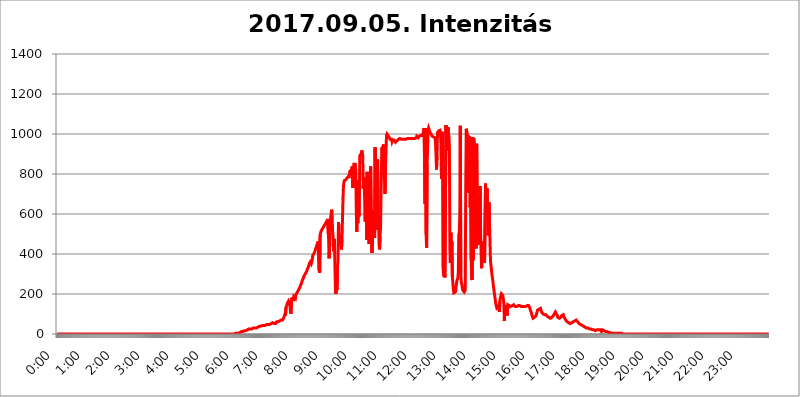
| Category | 2017.09.05. Intenzitás [W/m^2] |
|---|---|
| 0.0 | 0 |
| 0.0006944444444444445 | 0 |
| 0.001388888888888889 | 0 |
| 0.0020833333333333333 | 0 |
| 0.002777777777777778 | 0 |
| 0.003472222222222222 | 0 |
| 0.004166666666666667 | 0 |
| 0.004861111111111111 | 0 |
| 0.005555555555555556 | 0 |
| 0.0062499999999999995 | 0 |
| 0.006944444444444444 | 0 |
| 0.007638888888888889 | 0 |
| 0.008333333333333333 | 0 |
| 0.009027777777777779 | 0 |
| 0.009722222222222222 | 0 |
| 0.010416666666666666 | 0 |
| 0.011111111111111112 | 0 |
| 0.011805555555555555 | 0 |
| 0.012499999999999999 | 0 |
| 0.013194444444444444 | 0 |
| 0.013888888888888888 | 0 |
| 0.014583333333333332 | 0 |
| 0.015277777777777777 | 0 |
| 0.015972222222222224 | 0 |
| 0.016666666666666666 | 0 |
| 0.017361111111111112 | 0 |
| 0.018055555555555557 | 0 |
| 0.01875 | 0 |
| 0.019444444444444445 | 0 |
| 0.02013888888888889 | 0 |
| 0.020833333333333332 | 0 |
| 0.02152777777777778 | 0 |
| 0.022222222222222223 | 0 |
| 0.02291666666666667 | 0 |
| 0.02361111111111111 | 0 |
| 0.024305555555555556 | 0 |
| 0.024999999999999998 | 0 |
| 0.025694444444444447 | 0 |
| 0.02638888888888889 | 0 |
| 0.027083333333333334 | 0 |
| 0.027777777777777776 | 0 |
| 0.02847222222222222 | 0 |
| 0.029166666666666664 | 0 |
| 0.029861111111111113 | 0 |
| 0.030555555555555555 | 0 |
| 0.03125 | 0 |
| 0.03194444444444445 | 0 |
| 0.03263888888888889 | 0 |
| 0.03333333333333333 | 0 |
| 0.034027777777777775 | 0 |
| 0.034722222222222224 | 0 |
| 0.035416666666666666 | 0 |
| 0.036111111111111115 | 0 |
| 0.03680555555555556 | 0 |
| 0.0375 | 0 |
| 0.03819444444444444 | 0 |
| 0.03888888888888889 | 0 |
| 0.03958333333333333 | 0 |
| 0.04027777777777778 | 0 |
| 0.04097222222222222 | 0 |
| 0.041666666666666664 | 0 |
| 0.042361111111111106 | 0 |
| 0.04305555555555556 | 0 |
| 0.043750000000000004 | 0 |
| 0.044444444444444446 | 0 |
| 0.04513888888888889 | 0 |
| 0.04583333333333334 | 0 |
| 0.04652777777777778 | 0 |
| 0.04722222222222222 | 0 |
| 0.04791666666666666 | 0 |
| 0.04861111111111111 | 0 |
| 0.049305555555555554 | 0 |
| 0.049999999999999996 | 0 |
| 0.05069444444444445 | 0 |
| 0.051388888888888894 | 0 |
| 0.052083333333333336 | 0 |
| 0.05277777777777778 | 0 |
| 0.05347222222222222 | 0 |
| 0.05416666666666667 | 0 |
| 0.05486111111111111 | 0 |
| 0.05555555555555555 | 0 |
| 0.05625 | 0 |
| 0.05694444444444444 | 0 |
| 0.057638888888888885 | 0 |
| 0.05833333333333333 | 0 |
| 0.05902777777777778 | 0 |
| 0.059722222222222225 | 0 |
| 0.06041666666666667 | 0 |
| 0.061111111111111116 | 0 |
| 0.06180555555555556 | 0 |
| 0.0625 | 0 |
| 0.06319444444444444 | 0 |
| 0.06388888888888888 | 0 |
| 0.06458333333333334 | 0 |
| 0.06527777777777778 | 0 |
| 0.06597222222222222 | 0 |
| 0.06666666666666667 | 0 |
| 0.06736111111111111 | 0 |
| 0.06805555555555555 | 0 |
| 0.06874999999999999 | 0 |
| 0.06944444444444443 | 0 |
| 0.07013888888888889 | 0 |
| 0.07083333333333333 | 0 |
| 0.07152777777777779 | 0 |
| 0.07222222222222223 | 0 |
| 0.07291666666666667 | 0 |
| 0.07361111111111111 | 0 |
| 0.07430555555555556 | 0 |
| 0.075 | 0 |
| 0.07569444444444444 | 0 |
| 0.0763888888888889 | 0 |
| 0.07708333333333334 | 0 |
| 0.07777777777777778 | 0 |
| 0.07847222222222222 | 0 |
| 0.07916666666666666 | 0 |
| 0.0798611111111111 | 0 |
| 0.08055555555555556 | 0 |
| 0.08125 | 0 |
| 0.08194444444444444 | 0 |
| 0.08263888888888889 | 0 |
| 0.08333333333333333 | 0 |
| 0.08402777777777777 | 0 |
| 0.08472222222222221 | 0 |
| 0.08541666666666665 | 0 |
| 0.08611111111111112 | 0 |
| 0.08680555555555557 | 0 |
| 0.08750000000000001 | 0 |
| 0.08819444444444445 | 0 |
| 0.08888888888888889 | 0 |
| 0.08958333333333333 | 0 |
| 0.09027777777777778 | 0 |
| 0.09097222222222222 | 0 |
| 0.09166666666666667 | 0 |
| 0.09236111111111112 | 0 |
| 0.09305555555555556 | 0 |
| 0.09375 | 0 |
| 0.09444444444444444 | 0 |
| 0.09513888888888888 | 0 |
| 0.09583333333333333 | 0 |
| 0.09652777777777777 | 0 |
| 0.09722222222222222 | 0 |
| 0.09791666666666667 | 0 |
| 0.09861111111111111 | 0 |
| 0.09930555555555555 | 0 |
| 0.09999999999999999 | 0 |
| 0.10069444444444443 | 0 |
| 0.1013888888888889 | 0 |
| 0.10208333333333335 | 0 |
| 0.10277777777777779 | 0 |
| 0.10347222222222223 | 0 |
| 0.10416666666666667 | 0 |
| 0.10486111111111111 | 0 |
| 0.10555555555555556 | 0 |
| 0.10625 | 0 |
| 0.10694444444444444 | 0 |
| 0.1076388888888889 | 0 |
| 0.10833333333333334 | 0 |
| 0.10902777777777778 | 0 |
| 0.10972222222222222 | 0 |
| 0.1111111111111111 | 0 |
| 0.11180555555555556 | 0 |
| 0.11180555555555556 | 0 |
| 0.1125 | 0 |
| 0.11319444444444444 | 0 |
| 0.11388888888888889 | 0 |
| 0.11458333333333333 | 0 |
| 0.11527777777777777 | 0 |
| 0.11597222222222221 | 0 |
| 0.11666666666666665 | 0 |
| 0.1173611111111111 | 0 |
| 0.11805555555555557 | 0 |
| 0.11944444444444445 | 0 |
| 0.12013888888888889 | 0 |
| 0.12083333333333333 | 0 |
| 0.12152777777777778 | 0 |
| 0.12222222222222223 | 0 |
| 0.12291666666666667 | 0 |
| 0.12291666666666667 | 0 |
| 0.12361111111111112 | 0 |
| 0.12430555555555556 | 0 |
| 0.125 | 0 |
| 0.12569444444444444 | 0 |
| 0.12638888888888888 | 0 |
| 0.12708333333333333 | 0 |
| 0.16875 | 0 |
| 0.12847222222222224 | 0 |
| 0.12916666666666668 | 0 |
| 0.12986111111111112 | 0 |
| 0.13055555555555556 | 0 |
| 0.13125 | 0 |
| 0.13194444444444445 | 0 |
| 0.1326388888888889 | 0 |
| 0.13333333333333333 | 0 |
| 0.13402777777777777 | 0 |
| 0.13402777777777777 | 0 |
| 0.13472222222222222 | 0 |
| 0.13541666666666666 | 0 |
| 0.1361111111111111 | 0 |
| 0.13749999999999998 | 0 |
| 0.13819444444444443 | 0 |
| 0.1388888888888889 | 0 |
| 0.13958333333333334 | 0 |
| 0.14027777777777778 | 0 |
| 0.14097222222222222 | 0 |
| 0.14166666666666666 | 0 |
| 0.1423611111111111 | 0 |
| 0.14305555555555557 | 0 |
| 0.14375000000000002 | 0 |
| 0.14444444444444446 | 0 |
| 0.1451388888888889 | 0 |
| 0.1451388888888889 | 0 |
| 0.14652777777777778 | 0 |
| 0.14722222222222223 | 0 |
| 0.14791666666666667 | 0 |
| 0.1486111111111111 | 0 |
| 0.14930555555555555 | 0 |
| 0.15 | 0 |
| 0.15069444444444444 | 0 |
| 0.15138888888888888 | 0 |
| 0.15208333333333332 | 0 |
| 0.15277777777777776 | 0 |
| 0.15347222222222223 | 0 |
| 0.15416666666666667 | 0 |
| 0.15486111111111112 | 0 |
| 0.15555555555555556 | 0 |
| 0.15625 | 0 |
| 0.15694444444444444 | 0 |
| 0.15763888888888888 | 0 |
| 0.15833333333333333 | 0 |
| 0.15902777777777777 | 0 |
| 0.15972222222222224 | 0 |
| 0.16041666666666668 | 0 |
| 0.16111111111111112 | 0 |
| 0.16180555555555556 | 0 |
| 0.1625 | 0 |
| 0.16319444444444445 | 0 |
| 0.1638888888888889 | 0 |
| 0.16458333333333333 | 0 |
| 0.16527777777777777 | 0 |
| 0.16597222222222222 | 0 |
| 0.16666666666666666 | 0 |
| 0.1673611111111111 | 0 |
| 0.16805555555555554 | 0 |
| 0.16874999999999998 | 0 |
| 0.16944444444444443 | 0 |
| 0.17013888888888887 | 0 |
| 0.1708333333333333 | 0 |
| 0.17152777777777775 | 0 |
| 0.17222222222222225 | 0 |
| 0.1729166666666667 | 0 |
| 0.17361111111111113 | 0 |
| 0.17430555555555557 | 0 |
| 0.17500000000000002 | 0 |
| 0.17569444444444446 | 0 |
| 0.1763888888888889 | 0 |
| 0.17708333333333334 | 0 |
| 0.17777777777777778 | 0 |
| 0.17847222222222223 | 0 |
| 0.17916666666666667 | 0 |
| 0.1798611111111111 | 0 |
| 0.18055555555555555 | 0 |
| 0.18125 | 0 |
| 0.18194444444444444 | 0 |
| 0.1826388888888889 | 0 |
| 0.18333333333333335 | 0 |
| 0.1840277777777778 | 0 |
| 0.18472222222222223 | 0 |
| 0.18541666666666667 | 0 |
| 0.18611111111111112 | 0 |
| 0.18680555555555556 | 0 |
| 0.1875 | 0 |
| 0.18819444444444444 | 0 |
| 0.18888888888888888 | 0 |
| 0.18958333333333333 | 0 |
| 0.19027777777777777 | 0 |
| 0.1909722222222222 | 0 |
| 0.19166666666666665 | 0 |
| 0.19236111111111112 | 0 |
| 0.19305555555555554 | 0 |
| 0.19375 | 0 |
| 0.19444444444444445 | 0 |
| 0.1951388888888889 | 0 |
| 0.19583333333333333 | 0 |
| 0.19652777777777777 | 0 |
| 0.19722222222222222 | 0 |
| 0.19791666666666666 | 0 |
| 0.1986111111111111 | 0 |
| 0.19930555555555554 | 0 |
| 0.19999999999999998 | 0 |
| 0.20069444444444443 | 0 |
| 0.20138888888888887 | 0 |
| 0.2020833333333333 | 0 |
| 0.2027777777777778 | 0 |
| 0.2034722222222222 | 0 |
| 0.2041666666666667 | 0 |
| 0.20486111111111113 | 0 |
| 0.20555555555555557 | 0 |
| 0.20625000000000002 | 0 |
| 0.20694444444444446 | 0 |
| 0.2076388888888889 | 0 |
| 0.20833333333333334 | 0 |
| 0.20902777777777778 | 0 |
| 0.20972222222222223 | 0 |
| 0.21041666666666667 | 0 |
| 0.2111111111111111 | 0 |
| 0.21180555555555555 | 0 |
| 0.2125 | 0 |
| 0.21319444444444444 | 0 |
| 0.2138888888888889 | 0 |
| 0.21458333333333335 | 0 |
| 0.2152777777777778 | 0 |
| 0.21597222222222223 | 0 |
| 0.21666666666666667 | 0 |
| 0.21736111111111112 | 0 |
| 0.21805555555555556 | 0 |
| 0.21875 | 0 |
| 0.21944444444444444 | 0 |
| 0.22013888888888888 | 0 |
| 0.22083333333333333 | 0 |
| 0.22152777777777777 | 0 |
| 0.2222222222222222 | 0 |
| 0.22291666666666665 | 0 |
| 0.2236111111111111 | 0 |
| 0.22430555555555556 | 0 |
| 0.225 | 0 |
| 0.22569444444444445 | 0 |
| 0.2263888888888889 | 0 |
| 0.22708333333333333 | 0 |
| 0.22777777777777777 | 0 |
| 0.22847222222222222 | 0 |
| 0.22916666666666666 | 0 |
| 0.2298611111111111 | 0 |
| 0.23055555555555554 | 0 |
| 0.23124999999999998 | 0 |
| 0.23194444444444443 | 0 |
| 0.23263888888888887 | 0 |
| 0.2333333333333333 | 0 |
| 0.2340277777777778 | 0 |
| 0.2347222222222222 | 0 |
| 0.2354166666666667 | 0 |
| 0.23611111111111113 | 0 |
| 0.23680555555555557 | 0 |
| 0.23750000000000002 | 0 |
| 0.23819444444444446 | 0 |
| 0.2388888888888889 | 0 |
| 0.23958333333333334 | 0 |
| 0.24027777777777778 | 0 |
| 0.24097222222222223 | 0 |
| 0.24166666666666667 | 0 |
| 0.2423611111111111 | 0 |
| 0.24305555555555555 | 0 |
| 0.24375 | 0 |
| 0.24444444444444446 | 0 |
| 0.24513888888888888 | 0 |
| 0.24583333333333335 | 0 |
| 0.2465277777777778 | 0 |
| 0.24722222222222223 | 0 |
| 0.24791666666666667 | 0 |
| 0.24861111111111112 | 0 |
| 0.24930555555555556 | 3.525 |
| 0.25 | 3.525 |
| 0.25069444444444444 | 3.525 |
| 0.2513888888888889 | 3.525 |
| 0.2520833333333333 | 3.525 |
| 0.25277777777777777 | 3.525 |
| 0.2534722222222222 | 3.525 |
| 0.25416666666666665 | 3.525 |
| 0.2548611111111111 | 7.887 |
| 0.2555555555555556 | 7.887 |
| 0.25625000000000003 | 7.887 |
| 0.2569444444444445 | 7.887 |
| 0.2576388888888889 | 7.887 |
| 0.25833333333333336 | 12.257 |
| 0.2590277777777778 | 12.257 |
| 0.25972222222222224 | 12.257 |
| 0.2604166666666667 | 12.257 |
| 0.2611111111111111 | 12.257 |
| 0.26180555555555557 | 16.636 |
| 0.2625 | 16.636 |
| 0.26319444444444445 | 16.636 |
| 0.2638888888888889 | 16.636 |
| 0.26458333333333334 | 16.636 |
| 0.2652777777777778 | 21.024 |
| 0.2659722222222222 | 21.024 |
| 0.26666666666666666 | 21.024 |
| 0.2673611111111111 | 21.024 |
| 0.26805555555555555 | 25.419 |
| 0.26875 | 25.419 |
| 0.26944444444444443 | 25.419 |
| 0.2701388888888889 | 25.419 |
| 0.2708333333333333 | 25.419 |
| 0.27152777777777776 | 25.419 |
| 0.2722222222222222 | 25.419 |
| 0.27291666666666664 | 25.419 |
| 0.2736111111111111 | 29.823 |
| 0.2743055555555555 | 29.823 |
| 0.27499999999999997 | 29.823 |
| 0.27569444444444446 | 29.823 |
| 0.27638888888888885 | 29.823 |
| 0.27708333333333335 | 29.823 |
| 0.2777777777777778 | 29.823 |
| 0.27847222222222223 | 29.823 |
| 0.2791666666666667 | 29.823 |
| 0.2798611111111111 | 29.823 |
| 0.28055555555555556 | 29.823 |
| 0.28125 | 34.234 |
| 0.28194444444444444 | 34.234 |
| 0.2826388888888889 | 38.653 |
| 0.2833333333333333 | 38.653 |
| 0.28402777777777777 | 38.653 |
| 0.2847222222222222 | 38.653 |
| 0.28541666666666665 | 38.653 |
| 0.28611111111111115 | 38.653 |
| 0.28680555555555554 | 38.653 |
| 0.28750000000000003 | 43.079 |
| 0.2881944444444445 | 43.079 |
| 0.2888888888888889 | 43.079 |
| 0.28958333333333336 | 43.079 |
| 0.2902777777777778 | 43.079 |
| 0.29097222222222224 | 43.079 |
| 0.2916666666666667 | 43.079 |
| 0.2923611111111111 | 43.079 |
| 0.29305555555555557 | 43.079 |
| 0.29375 | 47.511 |
| 0.29444444444444445 | 47.511 |
| 0.2951388888888889 | 47.511 |
| 0.29583333333333334 | 47.511 |
| 0.2965277777777778 | 47.511 |
| 0.2972222222222222 | 47.511 |
| 0.29791666666666666 | 47.511 |
| 0.2986111111111111 | 51.951 |
| 0.29930555555555555 | 51.951 |
| 0.3 | 51.951 |
| 0.30069444444444443 | 56.398 |
| 0.3013888888888889 | 56.398 |
| 0.3020833333333333 | 56.398 |
| 0.30277777777777776 | 56.398 |
| 0.3034722222222222 | 51.951 |
| 0.30416666666666664 | 51.951 |
| 0.3048611111111111 | 51.951 |
| 0.3055555555555555 | 47.511 |
| 0.30624999999999997 | 51.951 |
| 0.3069444444444444 | 56.398 |
| 0.3076388888888889 | 60.85 |
| 0.30833333333333335 | 65.31 |
| 0.3090277777777778 | 60.85 |
| 0.30972222222222223 | 60.85 |
| 0.3104166666666667 | 60.85 |
| 0.3111111111111111 | 60.85 |
| 0.31180555555555556 | 65.31 |
| 0.3125 | 65.31 |
| 0.31319444444444444 | 69.775 |
| 0.3138888888888889 | 69.775 |
| 0.3145833333333333 | 69.775 |
| 0.31527777777777777 | 69.775 |
| 0.3159722222222222 | 69.775 |
| 0.31666666666666665 | 74.246 |
| 0.31736111111111115 | 78.722 |
| 0.31805555555555554 | 78.722 |
| 0.31875000000000003 | 78.722 |
| 0.3194444444444445 | 101.184 |
| 0.3201388888888889 | 92.184 |
| 0.32083333333333336 | 132.814 |
| 0.3215277777777778 | 137.347 |
| 0.32222222222222224 | 146.423 |
| 0.3229166666666667 | 155.509 |
| 0.3236111111111111 | 155.509 |
| 0.32430555555555557 | 164.605 |
| 0.325 | 164.605 |
| 0.32569444444444445 | 169.156 |
| 0.3263888888888889 | 146.423 |
| 0.32708333333333334 | 114.716 |
| 0.3277777777777778 | 101.184 |
| 0.3284722222222222 | 164.605 |
| 0.32916666666666666 | 182.82 |
| 0.3298611111111111 | 178.264 |
| 0.33055555555555555 | 187.378 |
| 0.33125 | 164.605 |
| 0.33194444444444443 | 187.378 |
| 0.3326388888888889 | 187.378 |
| 0.3333333333333333 | 187.378 |
| 0.3340277777777778 | 178.264 |
| 0.3347222222222222 | 196.497 |
| 0.3354166666666667 | 196.497 |
| 0.3361111111111111 | 205.62 |
| 0.3368055555555556 | 210.182 |
| 0.33749999999999997 | 214.746 |
| 0.33819444444444446 | 219.309 |
| 0.33888888888888885 | 223.873 |
| 0.33958333333333335 | 228.436 |
| 0.34027777777777773 | 233 |
| 0.34097222222222223 | 242.127 |
| 0.3416666666666666 | 246.689 |
| 0.3423611111111111 | 251.251 |
| 0.3430555555555555 | 260.373 |
| 0.34375 | 269.49 |
| 0.3444444444444445 | 274.047 |
| 0.3451388888888889 | 278.603 |
| 0.3458333333333334 | 287.709 |
| 0.34652777777777777 | 287.709 |
| 0.34722222222222227 | 296.808 |
| 0.34791666666666665 | 301.354 |
| 0.34861111111111115 | 305.898 |
| 0.34930555555555554 | 310.44 |
| 0.35000000000000003 | 314.98 |
| 0.3506944444444444 | 324.052 |
| 0.3513888888888889 | 328.584 |
| 0.3520833333333333 | 333.113 |
| 0.3527777777777778 | 342.162 |
| 0.3534722222222222 | 351.198 |
| 0.3541666666666667 | 355.712 |
| 0.3548611111111111 | 360.221 |
| 0.35555555555555557 | 360.221 |
| 0.35625 | 351.198 |
| 0.35694444444444445 | 355.712 |
| 0.3576388888888889 | 369.23 |
| 0.35833333333333334 | 391.685 |
| 0.3590277777777778 | 391.685 |
| 0.3597222222222222 | 400.638 |
| 0.36041666666666666 | 405.108 |
| 0.3611111111111111 | 409.574 |
| 0.36180555555555555 | 414.035 |
| 0.3625 | 427.39 |
| 0.36319444444444443 | 431.833 |
| 0.3638888888888889 | 440.702 |
| 0.3645833333333333 | 449.551 |
| 0.3652777777777778 | 453.968 |
| 0.3659722222222222 | 462.786 |
| 0.3666666666666667 | 462.786 |
| 0.3673611111111111 | 314.98 |
| 0.3680555555555556 | 305.898 |
| 0.36874999999999997 | 497.836 |
| 0.36944444444444446 | 497.836 |
| 0.37013888888888885 | 515.223 |
| 0.37083333333333335 | 515.223 |
| 0.37152777777777773 | 519.555 |
| 0.37222222222222223 | 528.2 |
| 0.3729166666666666 | 532.513 |
| 0.3736111111111111 | 536.82 |
| 0.3743055555555555 | 541.121 |
| 0.375 | 545.416 |
| 0.3756944444444445 | 549.704 |
| 0.3763888888888889 | 553.986 |
| 0.3770833333333334 | 558.261 |
| 0.37777777777777777 | 558.261 |
| 0.37847222222222227 | 566.793 |
| 0.37916666666666665 | 575.299 |
| 0.37986111111111115 | 575.299 |
| 0.38055555555555554 | 480.356 |
| 0.38125000000000003 | 378.224 |
| 0.3819444444444444 | 427.39 |
| 0.3826388888888889 | 523.88 |
| 0.3833333333333333 | 579.542 |
| 0.3840277777777778 | 592.233 |
| 0.3847222222222222 | 621.613 |
| 0.3854166666666667 | 609.062 |
| 0.3861111111111111 | 515.223 |
| 0.38680555555555557 | 484.735 |
| 0.3875 | 414.035 |
| 0.38819444444444445 | 475.972 |
| 0.3888888888888889 | 445.129 |
| 0.38958333333333334 | 319.517 |
| 0.3902777777777778 | 210.182 |
| 0.3909722222222222 | 201.058 |
| 0.39166666666666666 | 228.436 |
| 0.3923611111111111 | 219.309 |
| 0.39305555555555555 | 337.639 |
| 0.39375 | 369.23 |
| 0.39444444444444443 | 558.261 |
| 0.3951388888888889 | 523.88 |
| 0.3958333333333333 | 480.356 |
| 0.3965277777777778 | 493.475 |
| 0.3972222222222222 | 458.38 |
| 0.3979166666666667 | 440.702 |
| 0.3986111111111111 | 422.943 |
| 0.3993055555555556 | 467.187 |
| 0.39999999999999997 | 467.187 |
| 0.40069444444444446 | 667.123 |
| 0.40138888888888885 | 735.89 |
| 0.40208333333333335 | 759.723 |
| 0.40277777777777773 | 767.62 |
| 0.40347222222222223 | 767.62 |
| 0.4041666666666666 | 767.62 |
| 0.4048611111111111 | 771.559 |
| 0.4055555555555555 | 775.492 |
| 0.40625 | 779.42 |
| 0.4069444444444445 | 779.42 |
| 0.4076388888888889 | 779.42 |
| 0.4083333333333334 | 787.258 |
| 0.40902777777777777 | 779.42 |
| 0.40972222222222227 | 798.974 |
| 0.41041666666666665 | 814.519 |
| 0.41111111111111115 | 810.641 |
| 0.41180555555555554 | 818.392 |
| 0.41250000000000003 | 818.392 |
| 0.4131944444444444 | 829.981 |
| 0.4138888888888889 | 837.682 |
| 0.4145833333333333 | 731.896 |
| 0.4152777777777778 | 798.974 |
| 0.4159722222222222 | 849.199 |
| 0.4166666666666667 | 853.029 |
| 0.4173611111111111 | 849.199 |
| 0.41805555555555557 | 849.199 |
| 0.41875 | 814.519 |
| 0.41944444444444445 | 609.062 |
| 0.4201388888888889 | 510.885 |
| 0.42083333333333334 | 683.473 |
| 0.4215277777777778 | 553.986 |
| 0.4222222222222222 | 767.62 |
| 0.42291666666666666 | 588.009 |
| 0.4236111111111111 | 600.661 |
| 0.42430555555555555 | 891.099 |
| 0.425 | 894.885 |
| 0.42569444444444443 | 891.099 |
| 0.4263888888888889 | 902.447 |
| 0.4270833333333333 | 917.534 |
| 0.4277777777777778 | 909.996 |
| 0.4284722222222222 | 891.099 |
| 0.4291666666666667 | 727.896 |
| 0.4298611111111111 | 783.342 |
| 0.4305555555555556 | 751.803 |
| 0.43124999999999997 | 663.019 |
| 0.43194444444444446 | 562.53 |
| 0.43263888888888885 | 779.42 |
| 0.43333333333333335 | 719.877 |
| 0.43402777777777773 | 471.582 |
| 0.43472222222222223 | 810.641 |
| 0.4354166666666666 | 625.784 |
| 0.4361111111111111 | 515.223 |
| 0.4368055555555555 | 771.559 |
| 0.4375 | 449.551 |
| 0.4381944444444445 | 617.436 |
| 0.4388888888888889 | 798.974 |
| 0.4395833333333334 | 837.682 |
| 0.44027777777777777 | 604.864 |
| 0.44097222222222227 | 414.035 |
| 0.44166666666666665 | 405.108 |
| 0.44236111111111115 | 523.88 |
| 0.44305555555555554 | 617.436 |
| 0.44375000000000003 | 528.2 |
| 0.4444444444444444 | 553.986 |
| 0.4451388888888889 | 480.356 |
| 0.4458333333333333 | 932.576 |
| 0.4465277777777778 | 755.766 |
| 0.4472222222222222 | 519.555 |
| 0.4479166666666667 | 837.682 |
| 0.4486111111111111 | 829.981 |
| 0.44930555555555557 | 872.114 |
| 0.45 | 609.062 |
| 0.45069444444444445 | 579.542 |
| 0.4513888888888889 | 445.129 |
| 0.45208333333333334 | 422.943 |
| 0.4527777777777778 | 484.735 |
| 0.4534722222222222 | 536.82 |
| 0.45416666666666666 | 715.858 |
| 0.4548611111111111 | 853.029 |
| 0.45555555555555555 | 932.576 |
| 0.45625 | 829.981 |
| 0.45694444444444443 | 940.082 |
| 0.4576388888888889 | 947.58 |
| 0.4583333333333333 | 787.258 |
| 0.4590277777777778 | 767.62 |
| 0.4597222222222222 | 699.717 |
| 0.4604166666666667 | 845.365 |
| 0.4611111111111111 | 845.365 |
| 0.4618055555555556 | 992.448 |
| 0.46249999999999997 | 999.916 |
| 0.46319444444444446 | 996.182 |
| 0.46388888888888885 | 992.448 |
| 0.46458333333333335 | 992.448 |
| 0.46527777777777773 | 988.714 |
| 0.46597222222222223 | 981.244 |
| 0.4666666666666666 | 973.772 |
| 0.4673611111111111 | 973.772 |
| 0.4680555555555555 | 973.772 |
| 0.46875 | 973.772 |
| 0.4694444444444445 | 962.555 |
| 0.4701388888888889 | 970.034 |
| 0.4708333333333334 | 966.295 |
| 0.47152777777777777 | 966.295 |
| 0.47222222222222227 | 970.034 |
| 0.47291666666666665 | 966.295 |
| 0.47361111111111115 | 966.295 |
| 0.47430555555555554 | 958.814 |
| 0.47500000000000003 | 955.071 |
| 0.4756944444444444 | 962.555 |
| 0.4763888888888889 | 966.295 |
| 0.4770833333333333 | 970.034 |
| 0.4777777777777778 | 970.034 |
| 0.4784722222222222 | 973.772 |
| 0.4791666666666667 | 977.508 |
| 0.4798611111111111 | 977.508 |
| 0.48055555555555557 | 977.508 |
| 0.48125 | 973.772 |
| 0.48194444444444445 | 973.772 |
| 0.4826388888888889 | 973.772 |
| 0.48333333333333334 | 973.772 |
| 0.4840277777777778 | 970.034 |
| 0.4847222222222222 | 973.772 |
| 0.48541666666666666 | 973.772 |
| 0.4861111111111111 | 973.772 |
| 0.48680555555555555 | 973.772 |
| 0.4875 | 973.772 |
| 0.48819444444444443 | 973.772 |
| 0.4888888888888889 | 973.772 |
| 0.4895833333333333 | 977.508 |
| 0.4902777777777778 | 977.508 |
| 0.4909722222222222 | 977.508 |
| 0.4916666666666667 | 977.508 |
| 0.4923611111111111 | 977.508 |
| 0.4930555555555556 | 977.508 |
| 0.49374999999999997 | 977.508 |
| 0.49444444444444446 | 977.508 |
| 0.49513888888888885 | 977.508 |
| 0.49583333333333335 | 981.244 |
| 0.49652777777777773 | 977.508 |
| 0.49722222222222223 | 977.508 |
| 0.4979166666666666 | 977.508 |
| 0.4986111111111111 | 981.244 |
| 0.4993055555555555 | 977.508 |
| 0.5 | 977.508 |
| 0.5006944444444444 | 977.508 |
| 0.5013888888888889 | 977.508 |
| 0.5020833333333333 | 977.508 |
| 0.5027777777777778 | 977.508 |
| 0.5034722222222222 | 981.244 |
| 0.5041666666666667 | 988.714 |
| 0.5048611111111111 | 984.98 |
| 0.5055555555555555 | 984.98 |
| 0.50625 | 981.244 |
| 0.5069444444444444 | 981.244 |
| 0.5076388888888889 | 988.714 |
| 0.5083333333333333 | 992.448 |
| 0.5090277777777777 | 992.448 |
| 0.5097222222222222 | 992.448 |
| 0.5104166666666666 | 996.182 |
| 0.5111111111111112 | 992.448 |
| 0.5118055555555555 | 992.448 |
| 0.5125000000000001 | 992.448 |
| 0.5131944444444444 | 1003.65 |
| 0.513888888888889 | 1018.587 |
| 0.5145833333333333 | 1029.798 |
| 0.5152777777777778 | 1029.798 |
| 0.5159722222222222 | 650.667 |
| 0.5166666666666667 | 1029.798 |
| 0.517361111111111 | 497.836 |
| 0.5180555555555556 | 431.833 |
| 0.5187499999999999 | 853.029 |
| 0.5194444444444445 | 921.298 |
| 0.5201388888888888 | 1018.587 |
| 0.5208333333333334 | 1029.798 |
| 0.5215277777777778 | 1026.06 |
| 0.5222222222222223 | 1014.852 |
| 0.5229166666666667 | 1007.383 |
| 0.5236111111111111 | 1003.65 |
| 0.5243055555555556 | 999.916 |
| 0.525 | 996.182 |
| 0.5256944444444445 | 988.714 |
| 0.5263888888888889 | 984.98 |
| 0.5270833333333333 | 984.98 |
| 0.5277777777777778 | 984.98 |
| 0.5284722222222222 | 984.98 |
| 0.5291666666666667 | 984.98 |
| 0.5298611111111111 | 981.244 |
| 0.5305555555555556 | 951.327 |
| 0.53125 | 894.885 |
| 0.5319444444444444 | 822.26 |
| 0.5326388888888889 | 891.099 |
| 0.5333333333333333 | 1007.383 |
| 0.5340277777777778 | 1007.383 |
| 0.5347222222222222 | 1014.852 |
| 0.5354166666666667 | 1014.852 |
| 0.5361111111111111 | 1014.852 |
| 0.5368055555555555 | 1018.587 |
| 0.5375 | 1007.383 |
| 0.5381944444444444 | 940.082 |
| 0.5388888888888889 | 775.492 |
| 0.5395833333333333 | 1011.118 |
| 0.5402777777777777 | 981.244 |
| 0.5409722222222222 | 342.162 |
| 0.5416666666666666 | 301.354 |
| 0.5423611111111112 | 287.709 |
| 0.5430555555555555 | 296.808 |
| 0.5437500000000001 | 283.156 |
| 0.5444444444444444 | 287.709 |
| 0.545138888888889 | 1044.762 |
| 0.5458333333333333 | 988.714 |
| 0.5465277777777778 | 973.772 |
| 0.5472222222222222 | 917.534 |
| 0.5479166666666667 | 1033.537 |
| 0.548611111111111 | 1007.383 |
| 0.5493055555555556 | 992.448 |
| 0.5499999999999999 | 932.576 |
| 0.5506944444444445 | 422.943 |
| 0.5513888888888888 | 355.712 |
| 0.5520833333333334 | 506.542 |
| 0.5527777777777778 | 422.943 |
| 0.5534722222222223 | 462.786 |
| 0.5541666666666667 | 287.709 |
| 0.5548611111111111 | 255.813 |
| 0.5555555555555556 | 223.873 |
| 0.55625 | 205.62 |
| 0.5569444444444445 | 201.058 |
| 0.5576388888888889 | 201.058 |
| 0.5583333333333333 | 210.182 |
| 0.5590277777777778 | 223.873 |
| 0.5597222222222222 | 246.689 |
| 0.5604166666666667 | 264.932 |
| 0.5611111111111111 | 269.49 |
| 0.5618055555555556 | 278.603 |
| 0.5625 | 305.898 |
| 0.5631944444444444 | 497.836 |
| 0.5638888888888889 | 506.542 |
| 0.5645833333333333 | 596.45 |
| 0.5652777777777778 | 1041.019 |
| 0.5659722222222222 | 301.354 |
| 0.5666666666666667 | 260.373 |
| 0.5673611111111111 | 251.251 |
| 0.5680555555555555 | 233 |
| 0.56875 | 219.309 |
| 0.5694444444444444 | 214.746 |
| 0.5701388888888889 | 219.309 |
| 0.5708333333333333 | 210.182 |
| 0.5715277777777777 | 205.62 |
| 0.5722222222222222 | 219.309 |
| 0.5729166666666666 | 731.896 |
| 0.5736111111111112 | 1026.06 |
| 0.5743055555555555 | 1014.852 |
| 0.5750000000000001 | 999.916 |
| 0.5756944444444444 | 707.8 |
| 0.576388888888889 | 992.448 |
| 0.5770833333333333 | 966.295 |
| 0.5777777777777778 | 988.714 |
| 0.5784722222222222 | 970.034 |
| 0.5791666666666667 | 634.105 |
| 0.579861111111111 | 806.757 |
| 0.5805555555555556 | 369.23 |
| 0.5812499999999999 | 278.603 |
| 0.5819444444444445 | 269.49 |
| 0.5826388888888888 | 984.98 |
| 0.5833333333333334 | 369.23 |
| 0.5840277777777778 | 977.508 |
| 0.5847222222222223 | 981.244 |
| 0.5854166666666667 | 928.819 |
| 0.5861111111111111 | 936.33 |
| 0.5868055555555556 | 449.551 |
| 0.5875 | 427.39 |
| 0.5881944444444445 | 951.327 |
| 0.5888888888888889 | 707.8 |
| 0.5895833333333333 | 675.311 |
| 0.5902777777777778 | 558.261 |
| 0.5909722222222222 | 502.192 |
| 0.5916666666666667 | 445.129 |
| 0.5923611111111111 | 541.121 |
| 0.5930555555555556 | 739.877 |
| 0.59375 | 502.192 |
| 0.5944444444444444 | 414.035 |
| 0.5951388888888889 | 328.584 |
| 0.5958333333333333 | 387.202 |
| 0.5965277777777778 | 427.39 |
| 0.5972222222222222 | 462.786 |
| 0.5979166666666667 | 382.715 |
| 0.5986111111111111 | 369.23 |
| 0.5993055555555555 | 355.712 |
| 0.6 | 351.198 |
| 0.6006944444444444 | 751.803 |
| 0.6013888888888889 | 671.22 |
| 0.6020833333333333 | 642.4 |
| 0.6027777777777777 | 727.896 |
| 0.6034722222222222 | 654.791 |
| 0.6041666666666666 | 493.475 |
| 0.6048611111111112 | 536.82 |
| 0.6055555555555555 | 658.909 |
| 0.6062500000000001 | 553.986 |
| 0.6069444444444444 | 462.786 |
| 0.607638888888889 | 364.728 |
| 0.6083333333333333 | 342.162 |
| 0.6090277777777778 | 319.517 |
| 0.6097222222222222 | 296.808 |
| 0.6104166666666667 | 278.603 |
| 0.611111111111111 | 260.373 |
| 0.6118055555555556 | 237.564 |
| 0.6124999999999999 | 219.309 |
| 0.6131944444444445 | 201.058 |
| 0.6138888888888888 | 182.82 |
| 0.6145833333333334 | 164.605 |
| 0.6152777777777778 | 146.423 |
| 0.6159722222222223 | 137.347 |
| 0.6166666666666667 | 128.284 |
| 0.6173611111111111 | 128.284 |
| 0.6180555555555556 | 128.284 |
| 0.61875 | 132.814 |
| 0.6194444444444445 | 146.423 |
| 0.6201388888888889 | 110.201 |
| 0.6208333333333333 | 164.605 |
| 0.6215277777777778 | 182.82 |
| 0.6222222222222222 | 191.937 |
| 0.6229166666666667 | 201.058 |
| 0.6236111111111111 | 201.058 |
| 0.6243055555555556 | 201.058 |
| 0.625 | 191.937 |
| 0.6256944444444444 | 173.709 |
| 0.6263888888888889 | 150.964 |
| 0.6270833333333333 | 65.31 |
| 0.6277777777777778 | 141.884 |
| 0.6284722222222222 | 132.814 |
| 0.6291666666666667 | 132.814 |
| 0.6298611111111111 | 132.814 |
| 0.6305555555555555 | 128.284 |
| 0.63125 | 92.184 |
| 0.6319444444444444 | 146.423 |
| 0.6326388888888889 | 146.423 |
| 0.6333333333333333 | 141.884 |
| 0.6340277777777777 | 141.884 |
| 0.6347222222222222 | 141.884 |
| 0.6354166666666666 | 141.884 |
| 0.6361111111111112 | 137.347 |
| 0.6368055555555555 | 137.347 |
| 0.6375000000000001 | 141.884 |
| 0.6381944444444444 | 141.884 |
| 0.638888888888889 | 146.423 |
| 0.6395833333333333 | 146.423 |
| 0.6402777777777778 | 146.423 |
| 0.6409722222222222 | 146.423 |
| 0.6416666666666667 | 141.884 |
| 0.642361111111111 | 137.347 |
| 0.6430555555555556 | 137.347 |
| 0.6437499999999999 | 137.347 |
| 0.6444444444444445 | 137.347 |
| 0.6451388888888888 | 137.347 |
| 0.6458333333333334 | 137.347 |
| 0.6465277777777778 | 141.884 |
| 0.6472222222222223 | 141.884 |
| 0.6479166666666667 | 141.884 |
| 0.6486111111111111 | 141.884 |
| 0.6493055555555556 | 137.347 |
| 0.65 | 137.347 |
| 0.6506944444444445 | 137.347 |
| 0.6513888888888889 | 137.347 |
| 0.6520833333333333 | 137.347 |
| 0.6527777777777778 | 137.347 |
| 0.6534722222222222 | 137.347 |
| 0.6541666666666667 | 137.347 |
| 0.6548611111111111 | 137.347 |
| 0.6555555555555556 | 137.347 |
| 0.65625 | 137.347 |
| 0.6569444444444444 | 137.347 |
| 0.6576388888888889 | 137.347 |
| 0.6583333333333333 | 137.347 |
| 0.6590277777777778 | 141.884 |
| 0.6597222222222222 | 141.884 |
| 0.6604166666666667 | 141.884 |
| 0.6611111111111111 | 141.884 |
| 0.6618055555555555 | 137.347 |
| 0.6625 | 132.814 |
| 0.6631944444444444 | 123.758 |
| 0.6638888888888889 | 119.235 |
| 0.6645833333333333 | 110.201 |
| 0.6652777777777777 | 101.184 |
| 0.6659722222222222 | 92.184 |
| 0.6666666666666666 | 87.692 |
| 0.6673611111111111 | 78.722 |
| 0.6680555555555556 | 78.722 |
| 0.6687500000000001 | 78.722 |
| 0.6694444444444444 | 83.205 |
| 0.6701388888888888 | 83.205 |
| 0.6708333333333334 | 83.205 |
| 0.6715277777777778 | 92.184 |
| 0.6722222222222222 | 101.184 |
| 0.6729166666666666 | 110.201 |
| 0.6736111111111112 | 119.235 |
| 0.6743055555555556 | 119.235 |
| 0.6749999999999999 | 119.235 |
| 0.6756944444444444 | 123.758 |
| 0.6763888888888889 | 128.284 |
| 0.6770833333333334 | 128.284 |
| 0.6777777777777777 | 128.284 |
| 0.6784722222222223 | 119.235 |
| 0.6791666666666667 | 110.201 |
| 0.6798611111111111 | 105.69 |
| 0.6805555555555555 | 105.69 |
| 0.68125 | 101.184 |
| 0.6819444444444445 | 101.184 |
| 0.6826388888888889 | 101.184 |
| 0.6833333333333332 | 96.682 |
| 0.6840277777777778 | 96.682 |
| 0.6847222222222222 | 96.682 |
| 0.6854166666666667 | 96.682 |
| 0.686111111111111 | 92.184 |
| 0.6868055555555556 | 92.184 |
| 0.6875 | 87.692 |
| 0.6881944444444444 | 83.205 |
| 0.688888888888889 | 83.205 |
| 0.6895833333333333 | 83.205 |
| 0.6902777777777778 | 78.722 |
| 0.6909722222222222 | 78.722 |
| 0.6916666666666668 | 78.722 |
| 0.6923611111111111 | 78.722 |
| 0.6930555555555555 | 78.722 |
| 0.69375 | 83.205 |
| 0.6944444444444445 | 83.205 |
| 0.6951388888888889 | 87.692 |
| 0.6958333333333333 | 92.184 |
| 0.6965277777777777 | 92.184 |
| 0.6972222222222223 | 101.184 |
| 0.6979166666666666 | 105.69 |
| 0.6986111111111111 | 110.201 |
| 0.6993055555555556 | 110.201 |
| 0.7000000000000001 | 101.184 |
| 0.7006944444444444 | 96.682 |
| 0.7013888888888888 | 92.184 |
| 0.7020833333333334 | 83.205 |
| 0.7027777777777778 | 78.722 |
| 0.7034722222222222 | 78.722 |
| 0.7041666666666666 | 78.722 |
| 0.7048611111111112 | 78.722 |
| 0.7055555555555556 | 83.205 |
| 0.7062499999999999 | 83.205 |
| 0.7069444444444444 | 87.692 |
| 0.7076388888888889 | 92.184 |
| 0.7083333333333334 | 96.682 |
| 0.7090277777777777 | 96.682 |
| 0.7097222222222223 | 96.682 |
| 0.7104166666666667 | 87.692 |
| 0.7111111111111111 | 83.205 |
| 0.7118055555555555 | 78.722 |
| 0.7125 | 74.246 |
| 0.7131944444444445 | 69.775 |
| 0.7138888888888889 | 65.31 |
| 0.7145833333333332 | 65.31 |
| 0.7152777777777778 | 60.85 |
| 0.7159722222222222 | 60.85 |
| 0.7166666666666667 | 60.85 |
| 0.717361111111111 | 56.398 |
| 0.7180555555555556 | 56.398 |
| 0.71875 | 56.398 |
| 0.7194444444444444 | 51.951 |
| 0.720138888888889 | 56.398 |
| 0.7208333333333333 | 56.398 |
| 0.7215277777777778 | 56.398 |
| 0.7222222222222222 | 56.398 |
| 0.7229166666666668 | 56.398 |
| 0.7236111111111111 | 60.85 |
| 0.7243055555555555 | 60.85 |
| 0.725 | 65.31 |
| 0.7256944444444445 | 65.31 |
| 0.7263888888888889 | 65.31 |
| 0.7270833333333333 | 69.775 |
| 0.7277777777777777 | 69.775 |
| 0.7284722222222223 | 65.31 |
| 0.7291666666666666 | 65.31 |
| 0.7298611111111111 | 60.85 |
| 0.7305555555555556 | 60.85 |
| 0.7312500000000001 | 56.398 |
| 0.7319444444444444 | 51.951 |
| 0.7326388888888888 | 51.951 |
| 0.7333333333333334 | 47.511 |
| 0.7340277777777778 | 47.511 |
| 0.7347222222222222 | 47.511 |
| 0.7354166666666666 | 43.079 |
| 0.7361111111111112 | 43.079 |
| 0.7368055555555556 | 38.653 |
| 0.7374999999999999 | 38.653 |
| 0.7381944444444444 | 38.653 |
| 0.7388888888888889 | 38.653 |
| 0.7395833333333334 | 34.234 |
| 0.7402777777777777 | 34.234 |
| 0.7409722222222223 | 34.234 |
| 0.7416666666666667 | 34.234 |
| 0.7423611111111111 | 29.823 |
| 0.7430555555555555 | 29.823 |
| 0.74375 | 29.823 |
| 0.7444444444444445 | 29.823 |
| 0.7451388888888889 | 25.419 |
| 0.7458333333333332 | 25.419 |
| 0.7465277777777778 | 25.419 |
| 0.7472222222222222 | 25.419 |
| 0.7479166666666667 | 25.419 |
| 0.748611111111111 | 25.419 |
| 0.7493055555555556 | 25.419 |
| 0.75 | 21.024 |
| 0.7506944444444444 | 21.024 |
| 0.751388888888889 | 21.024 |
| 0.7520833333333333 | 21.024 |
| 0.7527777777777778 | 21.024 |
| 0.7534722222222222 | 21.024 |
| 0.7541666666666668 | 16.636 |
| 0.7548611111111111 | 16.636 |
| 0.7555555555555555 | 16.636 |
| 0.75625 | 21.024 |
| 0.7569444444444445 | 21.024 |
| 0.7576388888888889 | 21.024 |
| 0.7583333333333333 | 21.024 |
| 0.7590277777777777 | 21.024 |
| 0.7597222222222223 | 21.024 |
| 0.7604166666666666 | 21.024 |
| 0.7611111111111111 | 21.024 |
| 0.7618055555555556 | 21.024 |
| 0.7625000000000001 | 16.636 |
| 0.7631944444444444 | 12.257 |
| 0.7638888888888888 | 12.257 |
| 0.7645833333333334 | 21.024 |
| 0.7652777777777778 | 16.636 |
| 0.7659722222222222 | 16.636 |
| 0.7666666666666666 | 16.636 |
| 0.7673611111111112 | 16.636 |
| 0.7680555555555556 | 12.257 |
| 0.7687499999999999 | 12.257 |
| 0.7694444444444444 | 12.257 |
| 0.7701388888888889 | 12.257 |
| 0.7708333333333334 | 12.257 |
| 0.7715277777777777 | 7.887 |
| 0.7722222222222223 | 7.887 |
| 0.7729166666666667 | 7.887 |
| 0.7736111111111111 | 7.887 |
| 0.7743055555555555 | 7.887 |
| 0.775 | 7.887 |
| 0.7756944444444445 | 3.525 |
| 0.7763888888888889 | 3.525 |
| 0.7770833333333332 | 3.525 |
| 0.7777777777777778 | 3.525 |
| 0.7784722222222222 | 3.525 |
| 0.7791666666666667 | 3.525 |
| 0.779861111111111 | 3.525 |
| 0.7805555555555556 | 3.525 |
| 0.78125 | 3.525 |
| 0.7819444444444444 | 3.525 |
| 0.782638888888889 | 3.525 |
| 0.7833333333333333 | 3.525 |
| 0.7840277777777778 | 3.525 |
| 0.7847222222222222 | 3.525 |
| 0.7854166666666668 | 3.525 |
| 0.7861111111111111 | 3.525 |
| 0.7868055555555555 | 3.525 |
| 0.7875 | 3.525 |
| 0.7881944444444445 | 3.525 |
| 0.7888888888888889 | 3.525 |
| 0.7895833333333333 | 3.525 |
| 0.7902777777777777 | 3.525 |
| 0.7909722222222223 | 3.525 |
| 0.7916666666666666 | 3.525 |
| 0.7923611111111111 | 3.525 |
| 0.7930555555555556 | 0 |
| 0.7937500000000001 | 0 |
| 0.7944444444444444 | 0 |
| 0.7951388888888888 | 0 |
| 0.7958333333333334 | 0 |
| 0.7965277777777778 | 0 |
| 0.7972222222222222 | 0 |
| 0.7979166666666666 | 0 |
| 0.7986111111111112 | 0 |
| 0.7993055555555556 | 0 |
| 0.7999999999999999 | 0 |
| 0.8006944444444444 | 0 |
| 0.8013888888888889 | 0 |
| 0.8020833333333334 | 0 |
| 0.8027777777777777 | 0 |
| 0.8034722222222223 | 0 |
| 0.8041666666666667 | 0 |
| 0.8048611111111111 | 0 |
| 0.8055555555555555 | 0 |
| 0.80625 | 0 |
| 0.8069444444444445 | 0 |
| 0.8076388888888889 | 0 |
| 0.8083333333333332 | 0 |
| 0.8090277777777778 | 0 |
| 0.8097222222222222 | 0 |
| 0.8104166666666667 | 0 |
| 0.811111111111111 | 0 |
| 0.8118055555555556 | 0 |
| 0.8125 | 0 |
| 0.8131944444444444 | 0 |
| 0.813888888888889 | 0 |
| 0.8145833333333333 | 0 |
| 0.8152777777777778 | 0 |
| 0.8159722222222222 | 0 |
| 0.8166666666666668 | 0 |
| 0.8173611111111111 | 0 |
| 0.8180555555555555 | 0 |
| 0.81875 | 0 |
| 0.8194444444444445 | 0 |
| 0.8201388888888889 | 0 |
| 0.8208333333333333 | 0 |
| 0.8215277777777777 | 0 |
| 0.8222222222222223 | 0 |
| 0.8229166666666666 | 0 |
| 0.8236111111111111 | 0 |
| 0.8243055555555556 | 0 |
| 0.8250000000000001 | 0 |
| 0.8256944444444444 | 0 |
| 0.8263888888888888 | 0 |
| 0.8270833333333334 | 0 |
| 0.8277777777777778 | 0 |
| 0.8284722222222222 | 0 |
| 0.8291666666666666 | 0 |
| 0.8298611111111112 | 0 |
| 0.8305555555555556 | 0 |
| 0.8312499999999999 | 0 |
| 0.8319444444444444 | 0 |
| 0.8326388888888889 | 0 |
| 0.8333333333333334 | 0 |
| 0.8340277777777777 | 0 |
| 0.8347222222222223 | 0 |
| 0.8354166666666667 | 0 |
| 0.8361111111111111 | 0 |
| 0.8368055555555555 | 0 |
| 0.8375 | 0 |
| 0.8381944444444445 | 0 |
| 0.8388888888888889 | 0 |
| 0.8395833333333332 | 0 |
| 0.8402777777777778 | 0 |
| 0.8409722222222222 | 0 |
| 0.8416666666666667 | 0 |
| 0.842361111111111 | 0 |
| 0.8430555555555556 | 0 |
| 0.84375 | 0 |
| 0.8444444444444444 | 0 |
| 0.845138888888889 | 0 |
| 0.8458333333333333 | 0 |
| 0.8465277777777778 | 0 |
| 0.8472222222222222 | 0 |
| 0.8479166666666668 | 0 |
| 0.8486111111111111 | 0 |
| 0.8493055555555555 | 0 |
| 0.85 | 0 |
| 0.8506944444444445 | 0 |
| 0.8513888888888889 | 0 |
| 0.8520833333333333 | 0 |
| 0.8527777777777777 | 0 |
| 0.8534722222222223 | 0 |
| 0.8541666666666666 | 0 |
| 0.8548611111111111 | 0 |
| 0.8555555555555556 | 0 |
| 0.8562500000000001 | 0 |
| 0.8569444444444444 | 0 |
| 0.8576388888888888 | 0 |
| 0.8583333333333334 | 0 |
| 0.8590277777777778 | 0 |
| 0.8597222222222222 | 0 |
| 0.8604166666666666 | 0 |
| 0.8611111111111112 | 0 |
| 0.8618055555555556 | 0 |
| 0.8624999999999999 | 0 |
| 0.8631944444444444 | 0 |
| 0.8638888888888889 | 0 |
| 0.8645833333333334 | 0 |
| 0.8652777777777777 | 0 |
| 0.8659722222222223 | 0 |
| 0.8666666666666667 | 0 |
| 0.8673611111111111 | 0 |
| 0.8680555555555555 | 0 |
| 0.86875 | 0 |
| 0.8694444444444445 | 0 |
| 0.8701388888888889 | 0 |
| 0.8708333333333332 | 0 |
| 0.8715277777777778 | 0 |
| 0.8722222222222222 | 0 |
| 0.8729166666666667 | 0 |
| 0.873611111111111 | 0 |
| 0.8743055555555556 | 0 |
| 0.875 | 0 |
| 0.8756944444444444 | 0 |
| 0.876388888888889 | 0 |
| 0.8770833333333333 | 0 |
| 0.8777777777777778 | 0 |
| 0.8784722222222222 | 0 |
| 0.8791666666666668 | 0 |
| 0.8798611111111111 | 0 |
| 0.8805555555555555 | 0 |
| 0.88125 | 0 |
| 0.8819444444444445 | 0 |
| 0.8826388888888889 | 0 |
| 0.8833333333333333 | 0 |
| 0.8840277777777777 | 0 |
| 0.8847222222222223 | 0 |
| 0.8854166666666666 | 0 |
| 0.8861111111111111 | 0 |
| 0.8868055555555556 | 0 |
| 0.8875000000000001 | 0 |
| 0.8881944444444444 | 0 |
| 0.8888888888888888 | 0 |
| 0.8895833333333334 | 0 |
| 0.8902777777777778 | 0 |
| 0.8909722222222222 | 0 |
| 0.8916666666666666 | 0 |
| 0.8923611111111112 | 0 |
| 0.8930555555555556 | 0 |
| 0.8937499999999999 | 0 |
| 0.8944444444444444 | 0 |
| 0.8951388888888889 | 0 |
| 0.8958333333333334 | 0 |
| 0.8965277777777777 | 0 |
| 0.8972222222222223 | 0 |
| 0.8979166666666667 | 0 |
| 0.8986111111111111 | 0 |
| 0.8993055555555555 | 0 |
| 0.9 | 0 |
| 0.9006944444444445 | 0 |
| 0.9013888888888889 | 0 |
| 0.9020833333333332 | 0 |
| 0.9027777777777778 | 0 |
| 0.9034722222222222 | 0 |
| 0.9041666666666667 | 0 |
| 0.904861111111111 | 0 |
| 0.9055555555555556 | 0 |
| 0.90625 | 0 |
| 0.9069444444444444 | 0 |
| 0.907638888888889 | 0 |
| 0.9083333333333333 | 0 |
| 0.9090277777777778 | 0 |
| 0.9097222222222222 | 0 |
| 0.9104166666666668 | 0 |
| 0.9111111111111111 | 0 |
| 0.9118055555555555 | 0 |
| 0.9125 | 0 |
| 0.9131944444444445 | 0 |
| 0.9138888888888889 | 0 |
| 0.9145833333333333 | 0 |
| 0.9152777777777777 | 0 |
| 0.9159722222222223 | 0 |
| 0.9166666666666666 | 0 |
| 0.9173611111111111 | 0 |
| 0.9180555555555556 | 0 |
| 0.9187500000000001 | 0 |
| 0.9194444444444444 | 0 |
| 0.9201388888888888 | 0 |
| 0.9208333333333334 | 0 |
| 0.9215277777777778 | 0 |
| 0.9222222222222222 | 0 |
| 0.9229166666666666 | 0 |
| 0.9236111111111112 | 0 |
| 0.9243055555555556 | 0 |
| 0.9249999999999999 | 0 |
| 0.9256944444444444 | 0 |
| 0.9263888888888889 | 0 |
| 0.9270833333333334 | 0 |
| 0.9277777777777777 | 0 |
| 0.9284722222222223 | 0 |
| 0.9291666666666667 | 0 |
| 0.9298611111111111 | 0 |
| 0.9305555555555555 | 0 |
| 0.93125 | 0 |
| 0.9319444444444445 | 0 |
| 0.9326388888888889 | 0 |
| 0.9333333333333332 | 0 |
| 0.9340277777777778 | 0 |
| 0.9347222222222222 | 0 |
| 0.9354166666666667 | 0 |
| 0.936111111111111 | 0 |
| 0.9368055555555556 | 0 |
| 0.9375 | 0 |
| 0.9381944444444444 | 0 |
| 0.938888888888889 | 0 |
| 0.9395833333333333 | 0 |
| 0.9402777777777778 | 0 |
| 0.9409722222222222 | 0 |
| 0.9416666666666668 | 0 |
| 0.9423611111111111 | 0 |
| 0.9430555555555555 | 0 |
| 0.94375 | 0 |
| 0.9444444444444445 | 0 |
| 0.9451388888888889 | 0 |
| 0.9458333333333333 | 0 |
| 0.9465277777777777 | 0 |
| 0.9472222222222223 | 0 |
| 0.9479166666666666 | 0 |
| 0.9486111111111111 | 0 |
| 0.9493055555555556 | 0 |
| 0.9500000000000001 | 0 |
| 0.9506944444444444 | 0 |
| 0.9513888888888888 | 0 |
| 0.9520833333333334 | 0 |
| 0.9527777777777778 | 0 |
| 0.9534722222222222 | 0 |
| 0.9541666666666666 | 0 |
| 0.9548611111111112 | 0 |
| 0.9555555555555556 | 0 |
| 0.9562499999999999 | 0 |
| 0.9569444444444444 | 0 |
| 0.9576388888888889 | 0 |
| 0.9583333333333334 | 0 |
| 0.9590277777777777 | 0 |
| 0.9597222222222223 | 0 |
| 0.9604166666666667 | 0 |
| 0.9611111111111111 | 0 |
| 0.9618055555555555 | 0 |
| 0.9625 | 0 |
| 0.9631944444444445 | 0 |
| 0.9638888888888889 | 0 |
| 0.9645833333333332 | 0 |
| 0.9652777777777778 | 0 |
| 0.9659722222222222 | 0 |
| 0.9666666666666667 | 0 |
| 0.967361111111111 | 0 |
| 0.9680555555555556 | 0 |
| 0.96875 | 0 |
| 0.9694444444444444 | 0 |
| 0.970138888888889 | 0 |
| 0.9708333333333333 | 0 |
| 0.9715277777777778 | 0 |
| 0.9722222222222222 | 0 |
| 0.9729166666666668 | 0 |
| 0.9736111111111111 | 0 |
| 0.9743055555555555 | 0 |
| 0.975 | 0 |
| 0.9756944444444445 | 0 |
| 0.9763888888888889 | 0 |
| 0.9770833333333333 | 0 |
| 0.9777777777777777 | 0 |
| 0.9784722222222223 | 0 |
| 0.9791666666666666 | 0 |
| 0.9798611111111111 | 0 |
| 0.9805555555555556 | 0 |
| 0.9812500000000001 | 0 |
| 0.9819444444444444 | 0 |
| 0.9826388888888888 | 0 |
| 0.9833333333333334 | 0 |
| 0.9840277777777778 | 0 |
| 0.9847222222222222 | 0 |
| 0.9854166666666666 | 0 |
| 0.9861111111111112 | 0 |
| 0.9868055555555556 | 0 |
| 0.9874999999999999 | 0 |
| 0.9881944444444444 | 0 |
| 0.9888888888888889 | 0 |
| 0.9895833333333334 | 0 |
| 0.9902777777777777 | 0 |
| 0.9909722222222223 | 0 |
| 0.9916666666666667 | 0 |
| 0.9923611111111111 | 0 |
| 0.9930555555555555 | 0 |
| 0.99375 | 0 |
| 0.9944444444444445 | 0 |
| 0.9951388888888889 | 0 |
| 0.9958333333333332 | 0 |
| 0.9965277777777778 | 0 |
| 0.9972222222222222 | 0 |
| 0.9979166666666667 | 0 |
| 0.998611111111111 | 0 |
| 0.9993055555555556 | 0 |